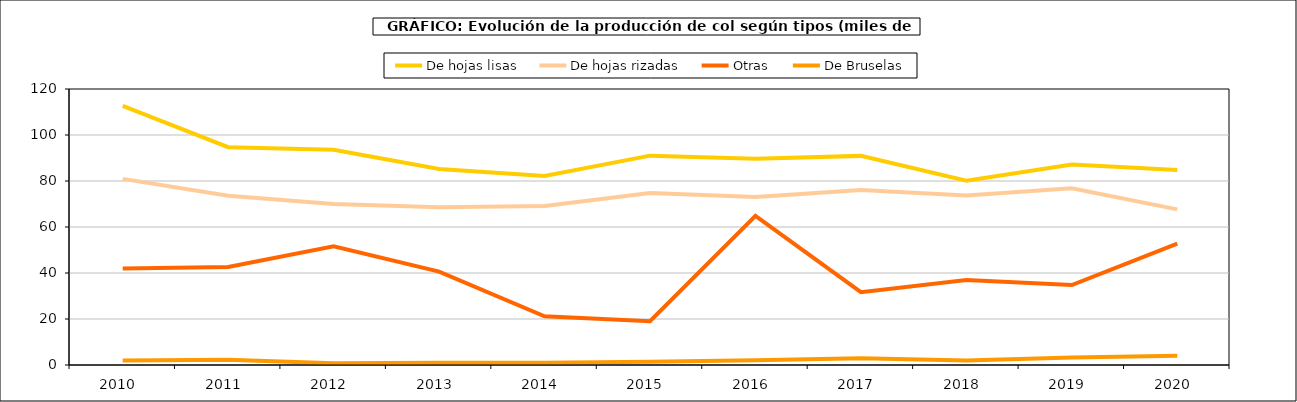
| Category | De hojas lisas | De hojas rizadas | Otras | De Bruselas |
|---|---|---|---|---|
| 2010.0 | 112.708 | 80.922 | 41.958 | 1.972 |
| 2011.0 | 94.724 | 73.591 | 42.575 | 2.237 |
| 2012.0 | 93.549 | 70.008 | 51.596 | 0.731 |
| 2013.0 | 85.207 | 68.536 | 40.593 | 0.965 |
| 2014.0 | 82.165 | 69.098 | 21.166 | 1.025 |
| 2015.0 | 91.025 | 74.746 | 19.06 | 1.371 |
| 2016.0 | 89.719 | 73.058 | 64.818 | 2.023 |
| 2017.0 | 90.922 | 76.042 | 31.66 | 2.985 |
| 2018.0 | 80.113 | 73.721 | 36.915 | 1.984 |
| 2019.0 | 87.207 | 76.809 | 34.763 | 3.306 |
| 2020.0 | 84.743 | 67.663 | 52.8 | 4.02 |